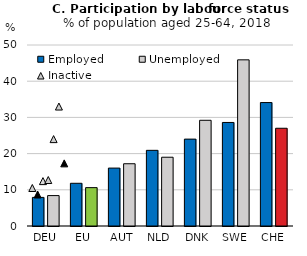
| Category | Employed | Unemployed |
|---|---|---|
| DEU | 7.9 | 8.4 |
| EU | 11.8 | 10.6 |
| AUT | 16 | 17.2 |
| NLD | 20.9 | 19 |
| DNK | 24 | 29.2 |
| SWE | 28.6 | 45.9 |
| CHE | 34.1 | 27 |